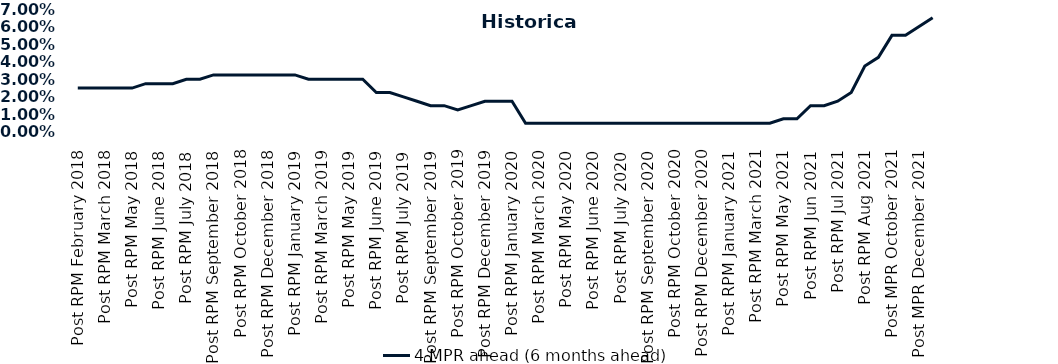
| Category | 4 MPR ahead (6 months ahead) |
|---|---|
| Post RPM February 2018 | 0.025 |
| Pre RPM March 2018 | 0.025 |
| Post RPM March 2018 | 0.025 |
| Pre RPM May 2018 | 0.025 |
| Post RPM May 2018 | 0.025 |
| Pre RPM June 2018 | 0.028 |
| Post RPM June 2018 | 0.028 |
| Pre RPM July 2018 | 0.028 |
| Post RPM July 2018 | 0.03 |
| Pre RPM September 2018 | 0.03 |
| Post RPM September 2018 | 0.032 |
| Pre RPM October 2018 | 0.032 |
| Post RPM October 2018 | 0.032 |
| Pre RPM December 2018 | 0.032 |
| Post RPM December 2018 | 0.032 |
| Pre RPM January 2019 | 0.032 |
| Post RPM January 2019 | 0.032 |
| Pre RPM March 2019 | 0.03 |
| Post RPM March 2019 | 0.03 |
| Pre RPM May 2019 | 0.03 |
| Post RPM May 2019 | 0.03 |
| Pre RPM June 2019 | 0.03 |
| Post RPM June 2019 | 0.022 |
| Pre RPM July 2019 | 0.022 |
| Post RPM July 2019 | 0.02 |
| Pre RPM September 2019 | 0.018 |
| Post RPM September 2019 | 0.015 |
| Pre RPM October 2019 | 0.015 |
| Post RPM October 2019 | 0.012 |
| Pre RPM December 2019 | 0.015 |
| Post RPM December 2019 | 0.018 |
| Pre RPM January 2020 | 0.018 |
| Post RPM January 2020 | 0.018 |
| Pre RPM March 2020 | 0.005 |
| Post RPM March 2020 | 0.005 |
| Pre RPM May 2020 | 0.005 |
| Post RPM May 2020 | 0.005 |
| Pre RPM June 2020 | 0.005 |
| Post RPM June 2020 | 0.005 |
| Pre RPM July 2020 | 0.005 |
| Post RPM July 2020 | 0.005 |
| Pre RPM September 2020 | 0.005 |
| Post RPM September 2020 | 0.005 |
| Pre RPM October 2020 | 0.005 |
| Post RPM October 2020 | 0.005 |
| Pre RPM December 2020 | 0.005 |
|  Post RPM December 2020 | 0.005 |
| Pre RPM January 2021 | 0.005 |
| Post RPM January 2021 | 0.005 |
|  Pre RPM March 2021 | 0.005 |
|  Post RPM March 2021 | 0.005 |
|  Pre RPM May 2021 | 0.005 |
|  Post RPM May 2021 | 0.008 |
|  Pre RPM Jun 2021 | 0.008 |
|   Post RPM Jun 2021 | 0.015 |
| Pre RPM Jul 2021 | 0.015 |
|  Post RPM Jul 2021 | 0.018 |
| Pre RPM Aug 2021 | 0.022 |
|  Post RPM Aug 2021 | 0.038 |
| Pre MPR October 2021 | 0.042 |
| Post MPR October 2021 | 0.055 |
| Pre MPR December 2021 | 0.055 |
| Post MPR December 2021 | 0.06 |
| Pre MPR January 2022 | 0.065 |